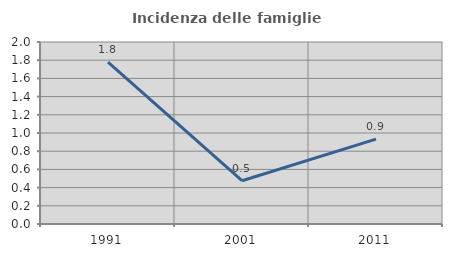
| Category | Incidenza delle famiglie numerose |
|---|---|
| 1991.0 | 1.779 |
| 2001.0 | 0.475 |
| 2011.0 | 0.933 |